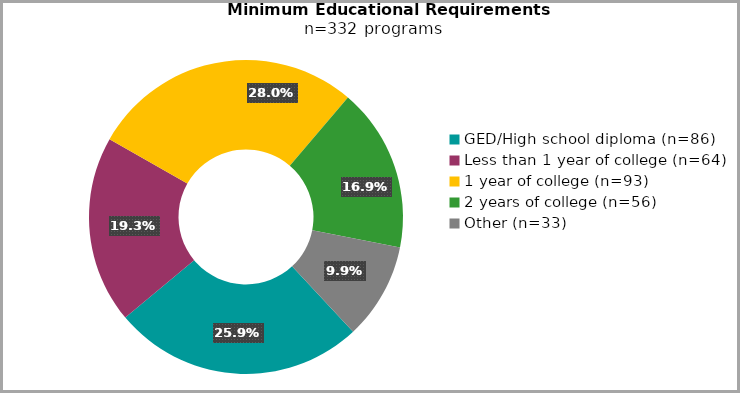
| Category | Series 0 |
|---|---|
| GED/High school diploma (n=86) | 0.259 |
| Less than 1 year of college (n=64) | 0.193 |
| 1 year of college (n=93) | 0.28 |
| 2 years of college (n=56) | 0.169 |
| Other (n=33) | 0.099 |